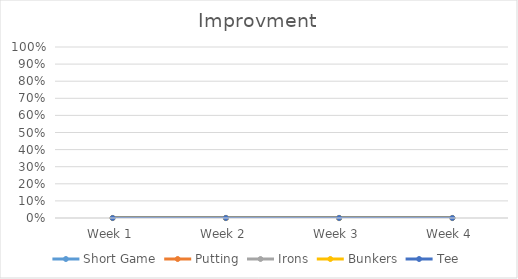
| Category | Short Game | Putting | Irons | Bunkers | Tee |
|---|---|---|---|---|---|
| Week 1 | 0 | 0 | 0 | 0 | 0 |
| Week 2 | 0 | 0 | 0 | 0 | 0 |
| Week 3 | 0 | 0 | 0 | 0 | 0 |
| Week 4 | 0 | 0 | 0 | 0 | 0 |